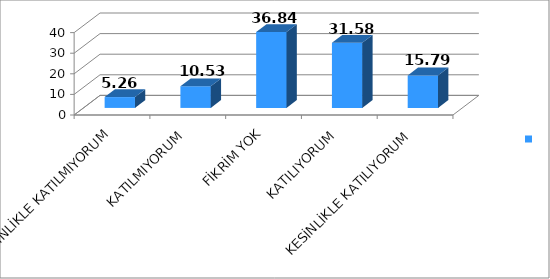
| Category | Series 0 |
|---|---|
| KESİNLİKLE KATILMIYORUM | 5.26 |
| KATILMIYORUM | 10.53 |
| FİKRİM YOK | 36.84 |
| KATILIYORUM | 31.58 |
| KESİNLİKLE KATILIYORUM | 15.79 |